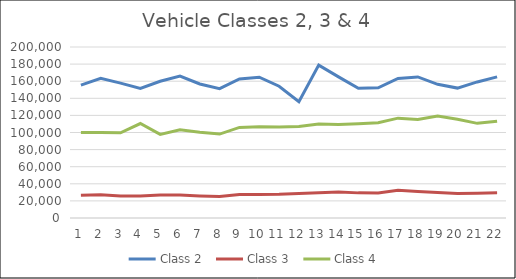
| Category | Class 2  | Class 3  | Class 4  |
|---|---|---|---|
| 0 | 155412 | 26464 | 100088 |
| 1 | 163285 | 27289 | 100011 |
| 2 | 157777 | 25774 | 99612 |
| 3 | 151660 | 25854 | 110499 |
| 4 | 159895 | 26765 | 97811 |
| 5 | 165946 | 26806 | 103094 |
| 6 | 156784 | 25721 | 100262 |
| 7 | 151222 | 25084 | 98169 |
| 8 | 162595 | 27459 | 105922 |
| 9 | 164728 | 27607 | 106594 |
| 10 | 154094 | 27658 | 106503 |
| 11 | 135958 | 28631 | 106925 |
| 12 | 178817 | 29468 | 109858 |
| 13 | 165078 | 30326 | 109489 |
| 14 | 151834 | 29387 | 110233 |
| 15 | 152207 | 29163 | 111352 |
| 16 | 163246 | 32427 | 116792 |
| 17 | 164985 | 30951 | 115168 |
| 18 | 156343 | 29692 | 119261 |
| 19 | 151947 | 28602 | 115410 |
| 20 | 159133 | 28806 | 110699 |
| 21 | 165023 | 29472 | 113283 |